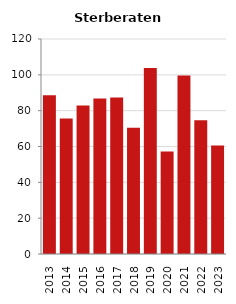
| Category | Sterberate der Bevölkerung ab 80 Jahre (auf Tsd.) |
|---|---|
| 2013.0 | 88.608 |
| 2014.0 | 75.581 |
| 2015.0 | 82.873 |
| 2016.0 | 86.735 |
| 2017.0 | 87.379 |
| 2018.0 | 70.423 |
| 2019.0 | 103.774 |
| 2020.0 | 57.269 |
| 2021.0 | 99.567 |
| 2022.0 | 74.689 |
| 2023.0 | 60.606 |